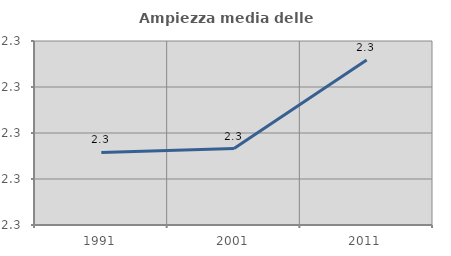
| Category | Ampiezza media delle famiglie |
|---|---|
| 1991.0 | 2.298 |
| 2001.0 | 2.298 |
| 2011.0 | 2.308 |